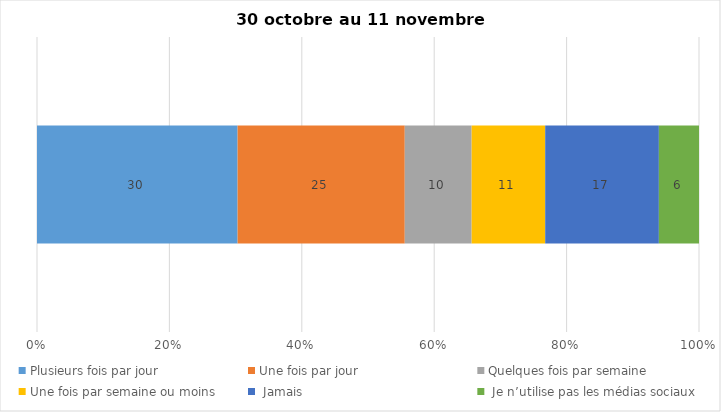
| Category | Plusieurs fois par jour | Une fois par jour | Quelques fois par semaine   | Une fois par semaine ou moins   |  Jamais   |  Je n’utilise pas les médias sociaux |
|---|---|---|---|---|---|---|
| 0 | 30 | 25 | 10 | 11 | 17 | 6 |